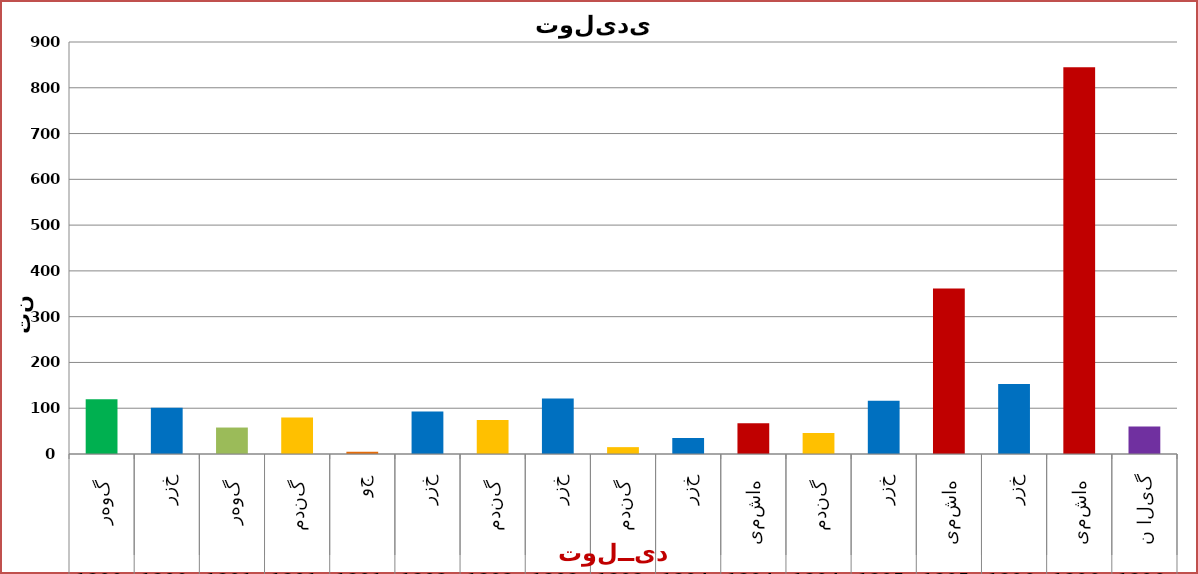
| Category | مقدار بذر استحصالی قابل توزیع  |
|---|---|
| 0 | 119760 |
| 1 | 100980 |
| 2 | 57810 |
| 3 | 79600 |
| 4 | 5000 |
| 5 | 92970 |
| 6 | 74000 |
| 7 | 120990 |
| 8 | 14985 |
| 9 | 34950 |
| 10 | 67050 |
| 11 | 45925 |
| 12 | 116240 |
| 13 | 361500 |
| 14 | 152740 |
| 15 | 844653 |
| 16 | 60259 |